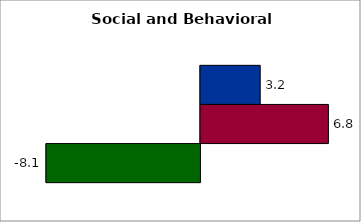
| Category | 50 states and D.C. | SREB states | State |
|---|---|---|---|
| 0 | 3.155 | 6.754 | -8.129 |